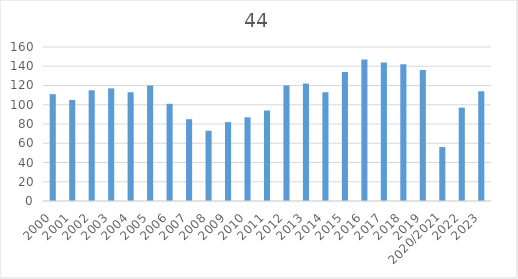
| Category | 44 |
|---|---|
| 2000 | 111 |
| 2001 | 105 |
| 2002 | 115 |
| 2003 | 117 |
| 2004 | 113 |
| 2005 | 120 |
| 2006 | 101 |
| 2007 | 85 |
| 2008 | 73 |
| 2009 | 82 |
| 2010 | 87 |
| 2011 | 94 |
| 2012 | 120 |
| 2013 | 122 |
| 2014 | 113 |
| 2015 | 134 |
| 2016 | 147 |
| 2017 | 144 |
| 2018 | 142 |
| 2019 | 136 |
| 2020/2021 | 56 |
| 2022 | 97 |
| 2023 | 114 |